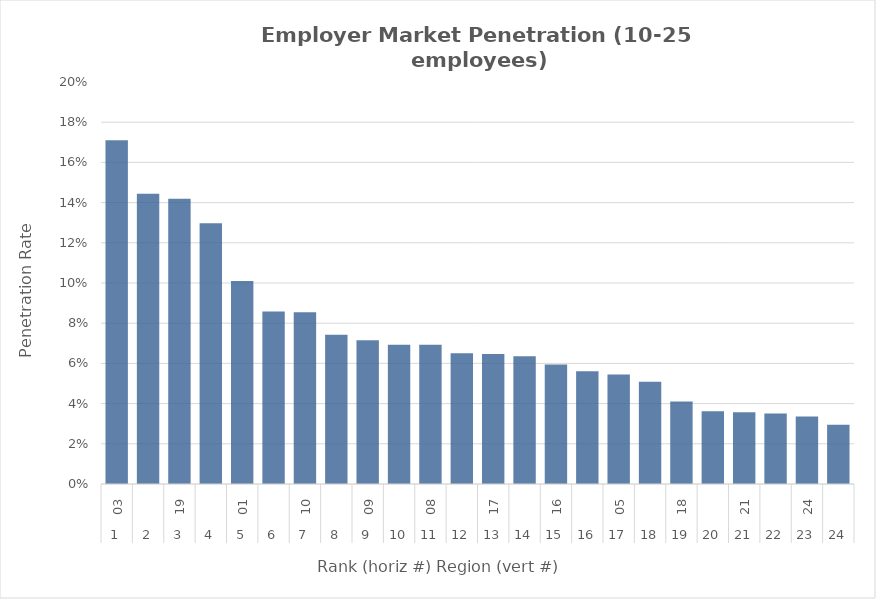
| Category | Rate |
|---|---|
| 0 | 0.171 |
| 1 | 0.144 |
| 2 | 0.142 |
| 3 | 0.13 |
| 4 | 0.101 |
| 5 | 0.086 |
| 6 | 0.085 |
| 7 | 0.074 |
| 8 | 0.072 |
| 9 | 0.069 |
| 10 | 0.069 |
| 11 | 0.065 |
| 12 | 0.065 |
| 13 | 0.064 |
| 14 | 0.059 |
| 15 | 0.056 |
| 16 | 0.054 |
| 17 | 0.051 |
| 18 | 0.041 |
| 19 | 0.036 |
| 20 | 0.036 |
| 21 | 0.035 |
| 22 | 0.034 |
| 23 | 0.029 |